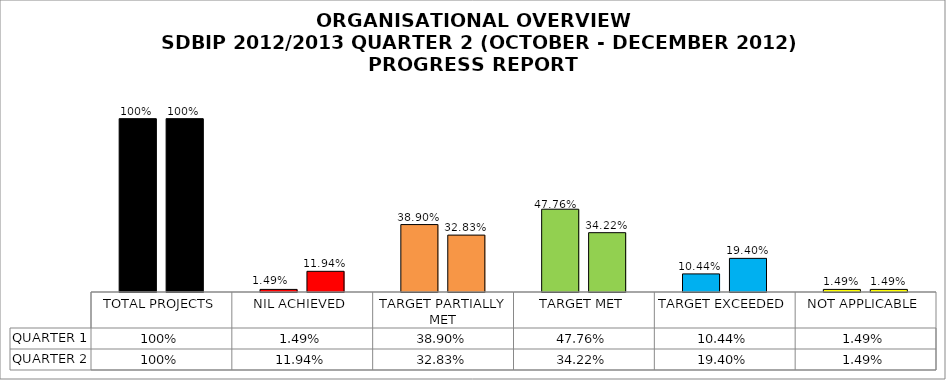
| Category | QUARTER 1 | QUARTER 2 |
|---|---|---|
| TOTAL PROJECTS | 1 | 1 |
| NIL ACHIEVED | 0.015 | 0.119 |
| TARGET PARTIALLY MET | 0.389 | 0.328 |
| TARGET MET | 0.478 | 0.342 |
| TARGET EXCEEDED | 0.104 | 0.194 |
| NOT APPLICABLE | 0.015 | 0.015 |